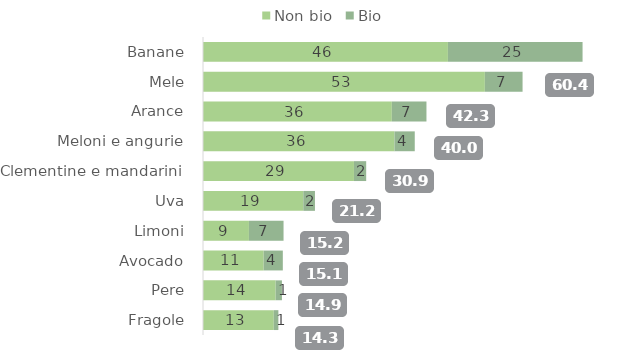
| Category | Non bio | Bio |
|---|---|---|
| Banane | 46.319 | 25.465 |
| Mele | 53.308 | 7.13 |
| Arance | 35.714 | 6.548 |
| Meloni e angurie | 36.206 | 3.842 |
| Clementine e mandarini | 28.549 | 2.316 |
| Uva | 18.971 | 2.203 |
| Limoni | 8.688 | 6.545 |
| Avocado | 11.475 | 3.62 |
| Pere | 13.743 | 1.184 |
| Fragole | 13.384 | 0.873 |